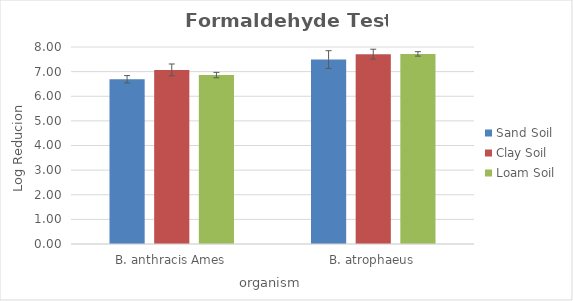
| Category | Sand Soil | Clay Soil | Loam Soil |
|---|---|---|---|
| B. anthracis Ames | 6.69 | 7.07 | 6.86 |
| B. atrophaeus | 7.49 | 7.71 | 7.72 |